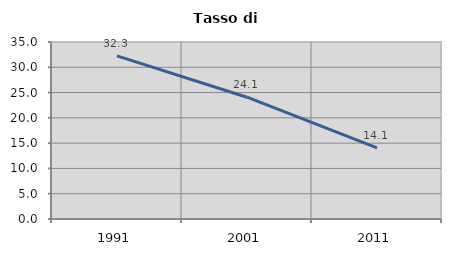
| Category | Tasso di disoccupazione   |
|---|---|
| 1991.0 | 32.269 |
| 2001.0 | 24.082 |
| 2011.0 | 14.083 |